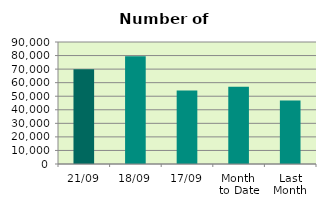
| Category | Series 0 |
|---|---|
| 21/09 | 69984 |
| 18/09 | 79504 |
| 17/09 | 54198 |
| Month 
to Date | 57076 |
| Last
Month | 46763.238 |